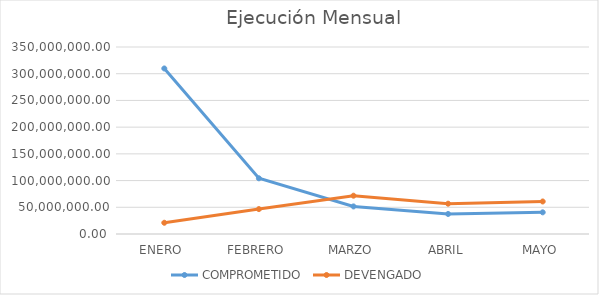
| Category | COMPROMETIDO | DEVENGADO |
|---|---|---|
| ENERO  | 309828241.26 | 21038537.98 |
| FEBRERO | 104251263.02 | 46631005.97 |
| MARZO | 51618868.39 | 71686483.12 |
| ABRIL | 37477691.18 | 56716659.76 |
| MAYO | 40560473.96 | 60865118.86 |